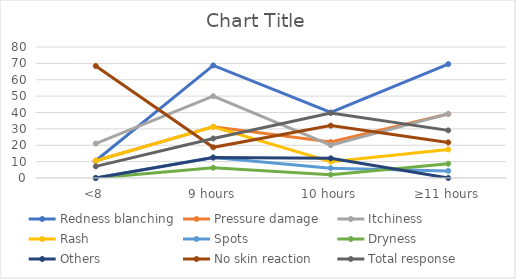
| Category | Redness blanching | Pressure damage | Itchiness | Rash | Spots | Dryness | Others | No skin reaction | Total response |
|---|---|---|---|---|---|---|---|---|---|
| <8 | 10.526 | 10.526 | 21.053 | 10.526 | 0 | 0 | 0 | 68.421 | 7.092 |
| 9 hours | 68.75 | 31.25 | 50 | 31.25 | 12.5 | 6.25 | 12.5 | 18.75 | 24.113 |
| 10 hours | 40 | 22 | 20 | 10 | 6 | 2 | 12 | 32 | 39.716 |
| ≥11 hours | 69.565 | 39.13 | 39.13 | 17.391 | 4.348 | 8.696 | 0 | 21.739 | 29.078 |